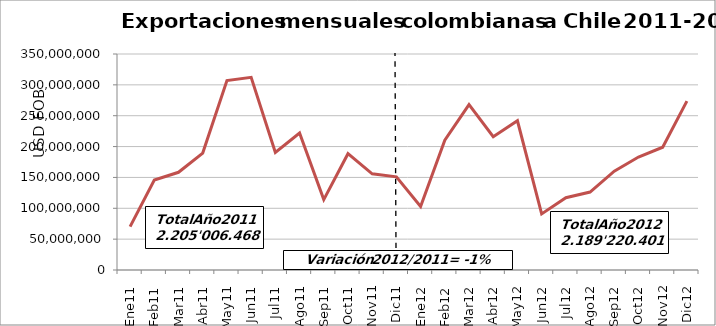
| Category | Series 0 |
|---|---|
| 0 | 70287314.85 |
| 1 | 145696944.72 |
| 2 | 158330136.14 |
| 3 | 189478513.74 |
| 4 | 307053242.77 |
| 5 | 312142509.84 |
| 6 | 190638374.41 |
| 7 | 222025731.11 |
| 8 | 114056717.47 |
| 9 | 188472836.65 |
| 10 | 155807199.05 |
| 11 | 151016947.01 |
| 12 | 102786313 |
| 13 | 210448747 |
| 14 | 267897092 |
| 15 | 216059229 |
| 16 | 241836709 |
| 17 | 90840694 |
| 18 | 117139055 |
| 19 | 126304237 |
| 20 | 160205467 |
| 21 | 183084274 |
| 22 | 198932236 |
| 23 | 273686348 |